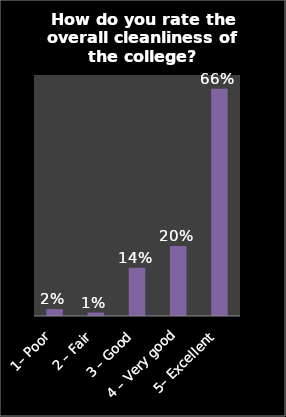
| Category | Series 0 |
|---|---|
| 1– Poor | 0.02 |
| 2 – Fair | 0.01 |
| 3 – Good | 0.14 |
| 4 – Very good | 0.203 |
| 5– Excellent | 0.66 |